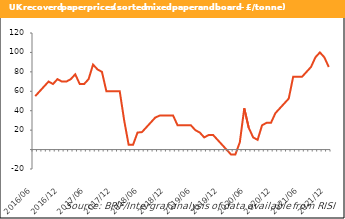
| Category | Recovered paper prices |
|---|---|
| 2016/06 | 55 |
| 2016/07 | 60 |
| 2016/08 | 65 |
| 2016/09 | 70 |
| 2016/10 | 67.5 |
| 2016/11 | 72.5 |
| 2016/12 | 70 |
| 2017/01 | 70 |
| 2017/02 | 72.5 |
| 2017/03 | 77.5 |
| 2017/04 | 67.5 |
| 2017/05 | 67.5 |
| 2017/06 | 72.5 |
| 2017/07 | 87.5 |
| 2017/08 | 82.5 |
| 2017/09 | 80 |
| 2017/10 | 60 |
| 2017/11 | 60 |
| 2017/12 | 60 |
| 2018/01 | 60 |
| 2018/02 | 30 |
| 2018/03 | 5 |
| 2018/04 | 5 |
| 2018/05 | 17.5 |
| 2018/06 | 18 |
| 2018/07 | 23 |
| 2018/08 | 28 |
| 2018/09 | 33 |
| 2018/10 | 35 |
| 2018/11 | 35 |
| 2018/12 | 35 |
| 2019/01 | 35 |
| 2019/02 | 25 |
| 2019/03 | 25 |
| 2019/04 | 25 |
| 2019/05 | 25 |
| 2019/06 | 20 |
| 2019/07 | 17.5 |
| 2019/08 | 12.5 |
| 2019/09 | 15 |
| 2019/10 | 15 |
| 2019/11 | 10 |
| 2019/12 | 5 |
| 2020/01 | 0 |
| 2020/02 | -5 |
| 2020/03 | -5 |
| 2020/04 | 7.5 |
| 2020/05 | 42.5 |
| 2020/06 | 22.5 |
| 2020/07 | 12.5 |
| 2020/08 | 10 |
| 2020/09 | 25 |
| 2020/10 | 27.5 |
| 2020/11 | 27.5 |
| 2020/12 | 37.5 |
| 2021/01 | 42.5 |
| 2021/02 | 47.5 |
| 2021/03 | 52.5 |
| 2021/04 | 75 |
| 2021/05 | 75 |
| 2021/06 | 75 |
| 2021/07 | 80 |
| 2021/08 | 85 |
| 2021/09 | 95 |
| 2021/10 | 100 |
| 2021/11 | 95 |
| 2021/12 | 85 |